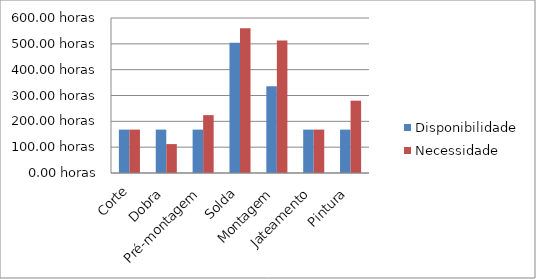
| Category | Disponibilidade | Necessidade |
|---|---|---|
| Corte | 168 | 168 |
| Dobra | 168 | 112 |
| Pré-montagem | 168 | 224 |
| Solda | 504 | 560 |
| Montagem | 336 | 513 |
| Jateamento | 168 | 168 |
| Pintura | 168 | 280 |